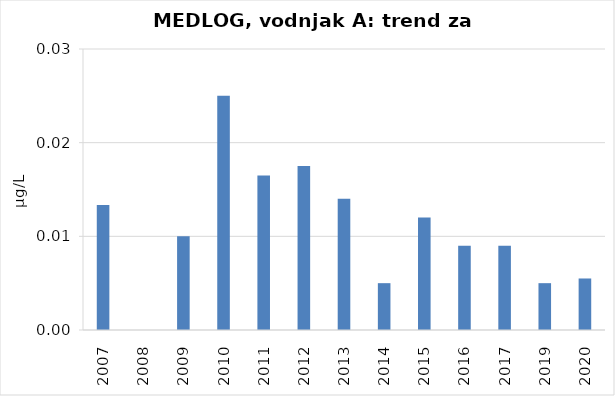
| Category | Vsota |
|---|---|
| 2007 | 0.013 |
| 2008 | 0 |
| 2009 | 0.01 |
| 2010 | 0.025 |
| 2011 | 0.016 |
| 2012 | 0.018 |
| 2013 | 0.014 |
| 2014 | 0.005 |
| 2015 | 0.012 |
| 2016 | 0.009 |
| 2017 | 0.009 |
| 2019 | 0.005 |
| 2020 | 0.006 |